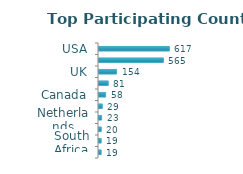
| Category | Total |
|---|---|
| USA | 617 |
| India | 565 |
| UK | 154 |
| Australia | 81 |
| Canada | 58 |
| Pakistan | 29 |
| Netherlands | 23 |
| Brasil | 20 |
| South Africa | 19 |
| UAE | 19 |